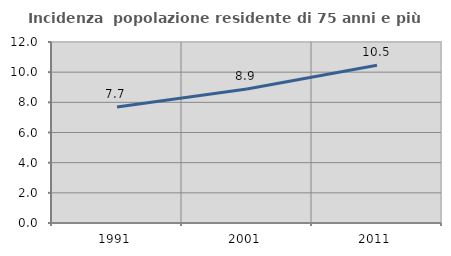
| Category | Incidenza  popolazione residente di 75 anni e più |
|---|---|
| 1991.0 | 7.692 |
| 2001.0 | 8.878 |
| 2011.0 | 10.455 |